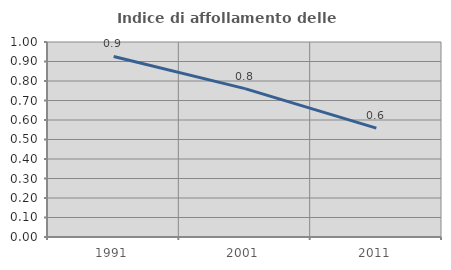
| Category | Indice di affollamento delle abitazioni  |
|---|---|
| 1991.0 | 0.926 |
| 2001.0 | 0.761 |
| 2011.0 | 0.558 |